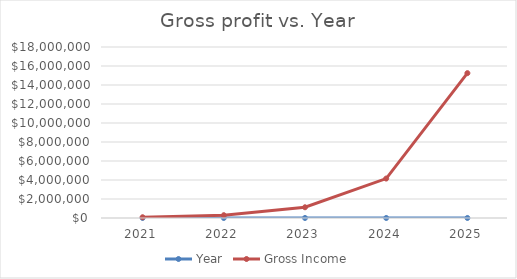
| Category | Year | Gross Income |
|---|---|---|
| 2021.0 | 2021 | 80000 |
| 2022.0 | 2022 | 295360 |
| 2023.0 | 2023 | 1129184 |
| 2024.0 | 2024 | 4151767.6 |
| 2025.0 | 2025 | 15247008.6 |